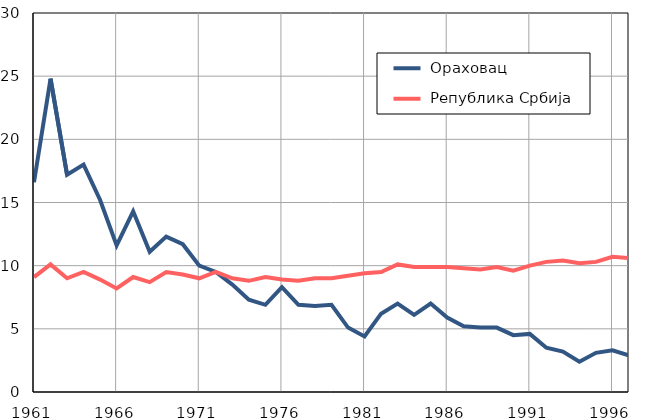
| Category |  Ораховац |  Република Србија |
|---|---|---|
| 1961.0 | 16.6 | 9.1 |
| 1962.0 | 24.8 | 10.1 |
| 1963.0 | 17.2 | 9 |
| 1964.0 | 18 | 9.5 |
| 1965.0 | 15.2 | 8.9 |
| 1966.0 | 11.6 | 8.2 |
| 1967.0 | 14.3 | 9.1 |
| 1968.0 | 11.1 | 8.7 |
| 1969.0 | 12.3 | 9.5 |
| 1970.0 | 11.7 | 9.3 |
| 1971.0 | 10 | 9 |
| 1972.0 | 9.5 | 9.5 |
| 1973.0 | 8.5 | 9 |
| 1974.0 | 7.3 | 8.8 |
| 1975.0 | 6.9 | 9.1 |
| 1976.0 | 8.3 | 8.9 |
| 1977.0 | 6.9 | 8.8 |
| 1978.0 | 6.8 | 9 |
| 1979.0 | 6.9 | 9 |
| 1980.0 | 5.1 | 9.2 |
| 1981.0 | 4.4 | 9.4 |
| 1982.0 | 6.2 | 9.5 |
| 1983.0 | 7 | 10.1 |
| 1984.0 | 6.1 | 9.9 |
| 1985.0 | 7 | 9.9 |
| 1986.0 | 5.9 | 9.9 |
| 1987.0 | 5.2 | 9.8 |
| 1988.0 | 5.1 | 9.7 |
| 1989.0 | 5.1 | 9.9 |
| 1990.0 | 4.5 | 9.6 |
| 1991.0 | 4.6 | 10 |
| 1992.0 | 3.5 | 10.3 |
| 1993.0 | 3.2 | 10.4 |
| 1994.0 | 2.4 | 10.2 |
| 1995.0 | 3.1 | 10.3 |
| 1996.0 | 3.3 | 10.7 |
| 1997.0 | 2.9 | 10.6 |